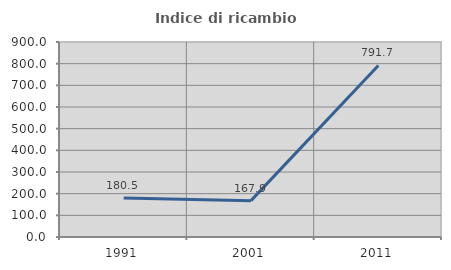
| Category | Indice di ricambio occupazionale  |
|---|---|
| 1991.0 | 180.488 |
| 2001.0 | 167.857 |
| 2011.0 | 791.667 |